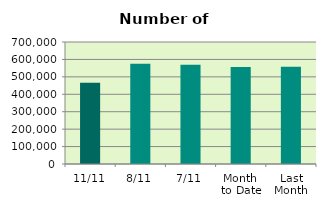
| Category | Series 0 |
|---|---|
| 11/11 | 466494 |
| 8/11 | 574808 |
| 7/11 | 568908 |
| Month 
to Date | 556305.429 |
| Last
Month | 558199.478 |